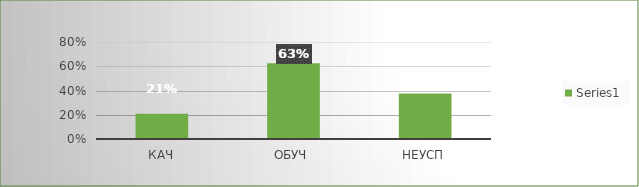
| Category | Series 0 |
|---|---|
| кач | 0.208 |
| обуч | 0.625 |
| неусп | 0.375 |